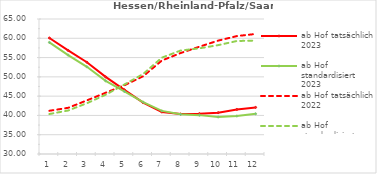
| Category | ab Hof tatsächlich 2023 | ab Hof standardisiert 2023 | ab Hof tatsächlich 2022 | ab Hof standardisiert 2022 |
|---|---|---|---|---|
| 0 | 60.079 | 58.932 | 41.209 | 40.362 |
| 1 | 56.852 | 55.642 | 41.971 | 41.272 |
| 2 | 53.8 | 52.604 | 43.896 | 43.162 |
| 3 | 49.988 | 48.967 | 45.88 | 45.363 |
| 4 | 46.633 | 46.22 | 47.817 | 48.017 |
| 5 | 43.305 | 43.446 | 50.151 | 50.736 |
| 6 | 40.89 | 41.173 | 54.241 | 54.98 |
| 7 | 40.358 | 40.282 | 56.176 | 56.822 |
| 8 | 40.463 | 40.078 | 57.817 | 57.398 |
| 9 | 40.72 | 39.596 | 59.388 | 58.221 |
| 10 | 41.55 | 39.844 | 60.575 | 59.299 |
| 11 | 42.082 | 40.422 | 61.116 | 59.402 |